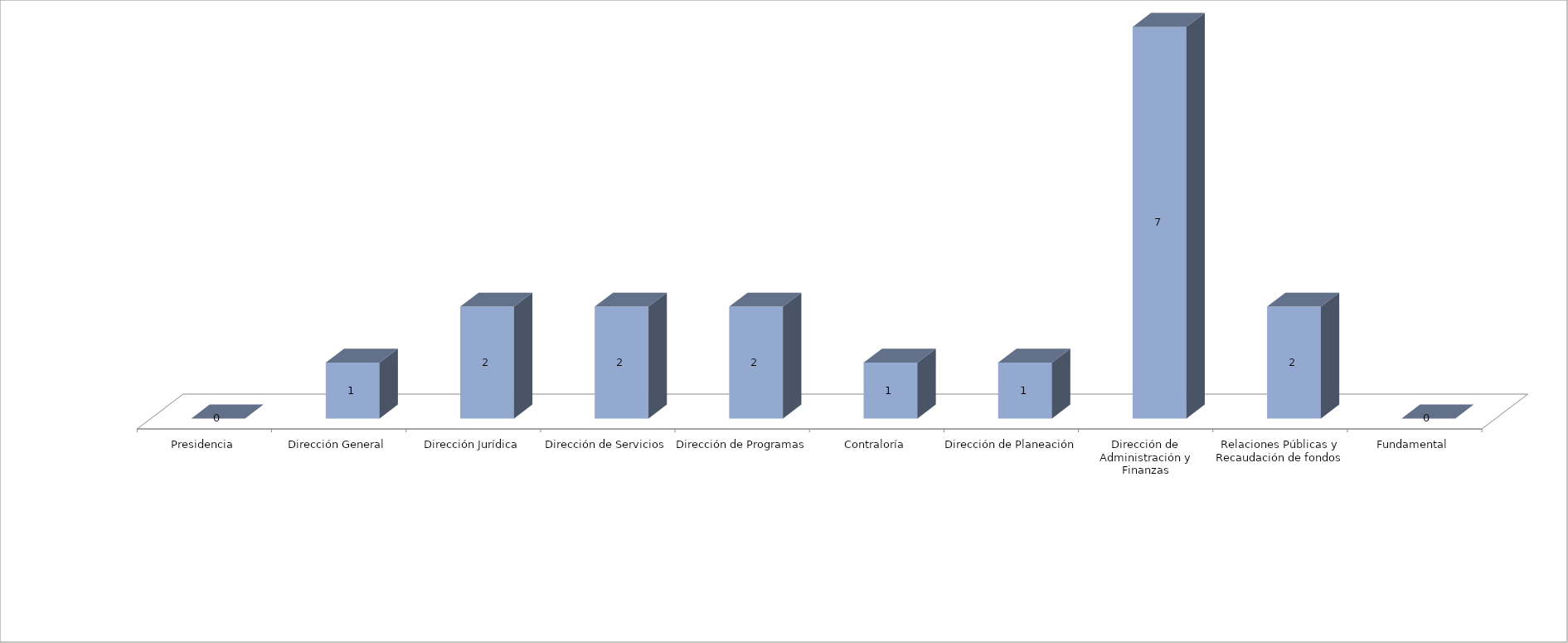
| Category | Series 0 | Series 1 |
|---|---|---|
| Presidencia |  | 0 |
| Dirección General |  | 1 |
| Dirección Jurídica |  | 2 |
| Dirección de Servicios |  | 2 |
| Dirección de Programas |  | 2 |
| Contraloría |  | 1 |
| Dirección de Planeación |  | 1 |
| Dirección de Administración y Finanzas |  | 7 |
| Relaciones Públicas y Recaudación de fondos |  | 2 |
| Fundamental |  | 0 |